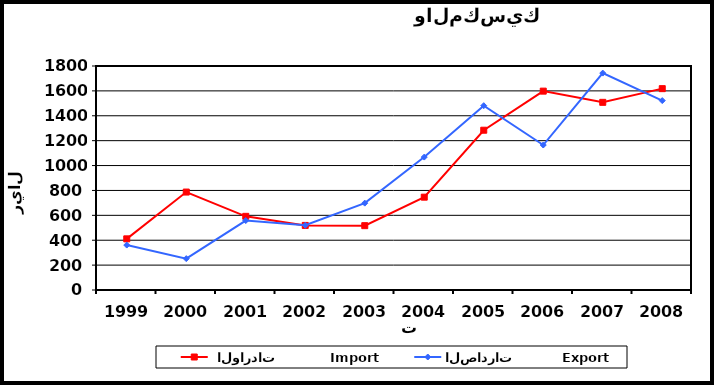
| Category |  الواردات           Import | الصادرات          Export |
|---|---|---|
| 1999.0 | 411 | 361 |
| 2000.0 | 787 | 252 |
| 2001.0 | 592 | 558 |
| 2002.0 | 519 | 520 |
| 2003.0 | 517 | 698 |
| 2004.0 | 746 | 1068 |
| 2005.0 | 1284 | 1481 |
| 2006.0 | 1598 | 1165 |
| 2007.0 | 1508 | 1743 |
| 2008.0 | 1618 | 1522 |